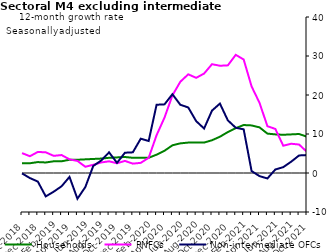
| Category | zero | Households | PNFCs | Non-intermediate OFCs |
|---|---|---|---|---|
| Oct-2018 | 0 | 2.5 | 5.1 | -0.1 |
| Nov-2018 | 0 | 2.5 | 4.3 | -1.3 |
| Dec-2018 | 0 | 2.8 | 5.4 | -2.2 |
| Jan-2019 | 0 | 2.7 | 5.3 | -6 |
| Feb-2019 | 0 | 3 | 4.4 | -4.8 |
| Mar-2019 | 0 | 3 | 4.6 | -3.4 |
| Apr-2019 | 0 | 3.4 | 3.5 | -1 |
| May-2019 | 0 | 3.4 | 3.1 | -6.6 |
| Jun-2019 | 0 | 3.5 | 1.6 | -3.6 |
| Jul-2019 | 0 | 3.6 | 2.1 | 1.8 |
| Aug-2019 | 0 | 3.7 | 2.7 | 3.2 |
| Sep-2019 | 0 | 3.9 | 3 | 5.3 |
| Oct-2019 | 0 | 4 | 2.5 | 2.6 |
| Nov-2019 | 0 | 4.1 | 3.1 | 5.2 |
| Dec-2019 | 0 | 3.9 | 2.4 | 5.3 |
| Jan-2020 | 0 | 3.9 | 2.6 | 8.8 |
| Feb-2020 | 0 | 3.9 | 3.9 | 8.2 |
| Mar-2020 | 0 | 4.7 | 9.7 | 17.5 |
| Apr-2020 | 0 | 5.7 | 14.2 | 17.6 |
| May-2020 | 0 | 7.1 | 19.9 | 20.2 |
| Jun-2020 | 0 | 7.6 | 23.4 | 17.5 |
| Jul-2020 | 0 | 7.8 | 25.3 | 16.8 |
| Aug-2020 | 0 | 7.8 | 24.4 | 13.3 |
| Sep-2020 | 0 | 7.8 | 25.5 | 11.4 |
| Oct-2020 | 0 | 8.4 | 27.9 | 16 |
| Nov-2020 | 0 | 9.3 | 27.5 | 17.8 |
| Dec-2020 | 0 | 10.5 | 27.6 | 13.5 |
| Jan-2021 | 0 | 11.5 | 30.3 | 11.6 |
| Feb-2021 | 0 | 12.3 | 29.1 | 11.2 |
| Mar-2021 | 0 | 12.2 | 22.2 | 0.5 |
| Apr-2021 | 0 | 11.7 | 18 | -0.8 |
| May-2021 | 0 | 10.1 | 12 | -1.4 |
| Jun-2021 | 0 | 9.9 | 11.3 | 0.9 |
| Jul-2021 | 0 | 9.8 | 7 | 1.5 |
| Aug-2021 | 0 | 9.9 | 7.5 | 2.9 |
| Sep-2021 | 0 | 10 | 7.3 | 4.5 |
| Oct-2021 | 0 | 9.3 | 5.4 | 4.6 |